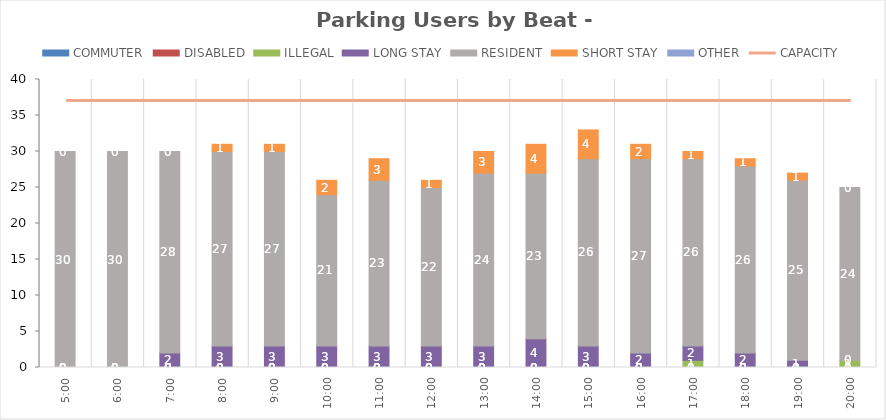
| Category | COMMUTER | DISABLED | ILLEGAL | LONG STAY | RESIDENT | SHORT STAY | OTHER |
|---|---|---|---|---|---|---|---|
| 0.20833333333333334 | 0 | 0 | 0 | 0 | 30 | 0 | 0 |
| 0.25 | 0 | 0 | 0 | 0 | 30 | 0 | 0 |
| 0.2916666666666667 | 0 | 0 | 0 | 2 | 28 | 0 | 0 |
| 0.3333333333333333 | 0 | 0 | 0 | 3 | 27 | 1 | 0 |
| 0.375 | 0 | 0 | 0 | 3 | 27 | 1 | 0 |
| 0.4166666666666667 | 0 | 0 | 0 | 3 | 21 | 2 | 0 |
| 0.4583333333333333 | 0 | 0 | 0 | 3 | 23 | 3 | 0 |
| 0.5 | 0 | 0 | 0 | 3 | 22 | 1 | 0 |
| 0.5416666666666666 | 0 | 0 | 0 | 3 | 24 | 3 | 0 |
| 0.5833333333333334 | 0 | 0 | 0 | 4 | 23 | 4 | 0 |
| 0.625 | 0 | 0 | 0 | 3 | 26 | 4 | 0 |
| 0.6666666666666666 | 0 | 0 | 0 | 2 | 27 | 2 | 0 |
| 0.7083333333333334 | 0 | 0 | 1 | 2 | 26 | 1 | 0 |
| 0.75 | 0 | 0 | 0 | 2 | 26 | 1 | 0 |
| 0.7916666666666666 | 0 | 0 | 0 | 1 | 25 | 1 | 0 |
| 0.8333333333333334 | 0 | 0 | 1 | 0 | 24 | 0 | 0 |